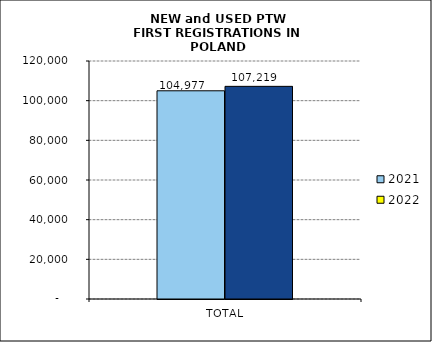
| Category | 2021 | 2022 |
|---|---|---|
| TOTAL | 104977 | 107219 |